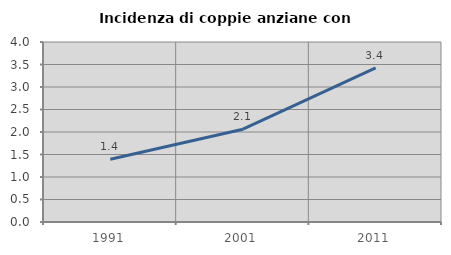
| Category | Incidenza di coppie anziane con figli |
|---|---|
| 1991.0 | 1.394 |
| 2001.0 | 2.063 |
| 2011.0 | 3.424 |